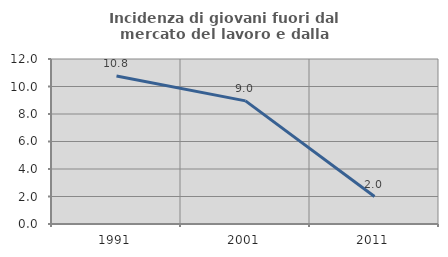
| Category | Incidenza di giovani fuori dal mercato del lavoro e dalla formazione  |
|---|---|
| 1991.0 | 10.769 |
| 2001.0 | 8.955 |
| 2011.0 | 2 |